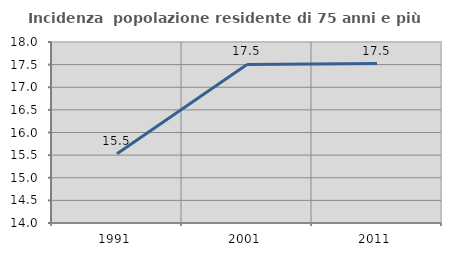
| Category | Incidenza  popolazione residente di 75 anni e più |
|---|---|
| 1991.0 | 15.532 |
| 2001.0 | 17.503 |
| 2011.0 | 17.523 |